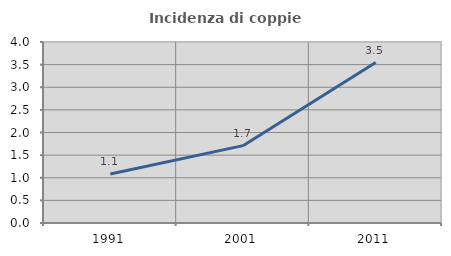
| Category | Incidenza di coppie miste |
|---|---|
| 1991.0 | 1.084 |
| 2001.0 | 1.709 |
| 2011.0 | 3.546 |